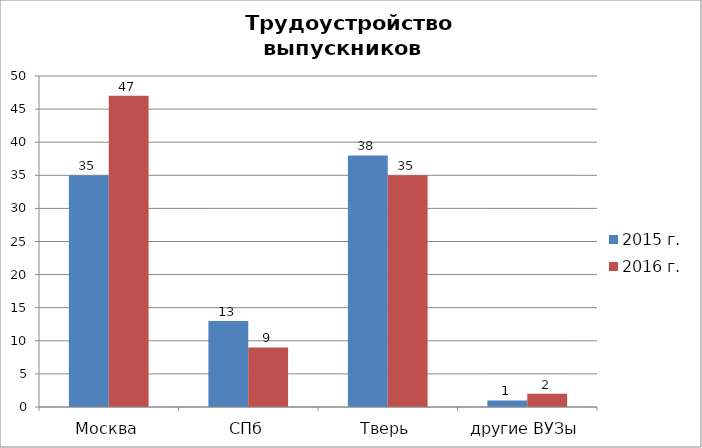
| Category | 2015 г. | 2016 г. |
|---|---|---|
| Москва | 35 | 47 |
| СПб | 13 | 9 |
| Тверь | 38 | 35 |
| другие ВУЗы | 1 | 2 |